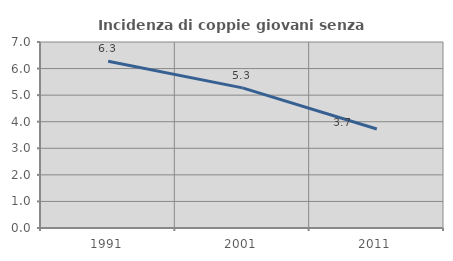
| Category | Incidenza di coppie giovani senza figli |
|---|---|
| 1991.0 | 6.272 |
| 2001.0 | 5.274 |
| 2011.0 | 3.724 |